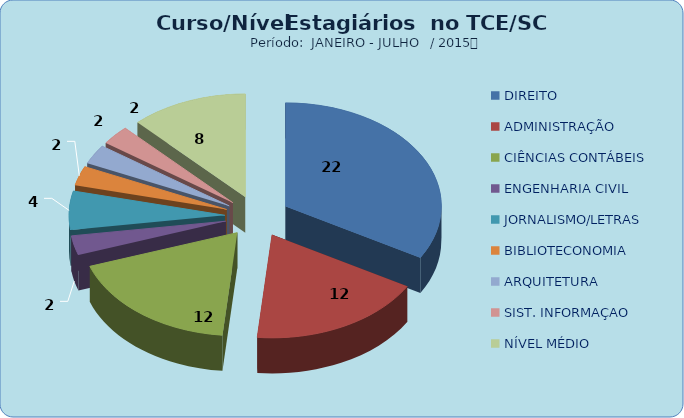
| Category | Series 0 |
|---|---|
| DIREITO | 22 |
| ADMINISTRAÇÃO | 12 |
| CIÊNCIAS CONTÁBEIS | 12 |
| ENGENHARIA CIVIL | 2 |
| JORNALISMO/LETRAS | 4 |
| BIBLIOTECONOMIA | 2 |
| ARQUITETURA | 2 |
| SIST. INFORMAÇAO | 2 |
| NÍVEL MÉDIO | 8 |